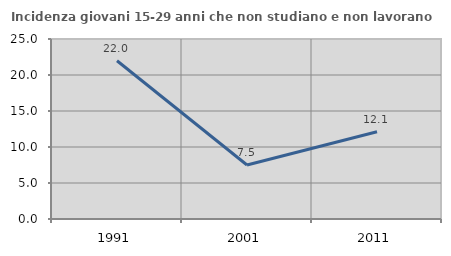
| Category | Incidenza giovani 15-29 anni che non studiano e non lavorano  |
|---|---|
| 1991.0 | 21.98 |
| 2001.0 | 7.5 |
| 2011.0 | 12.121 |